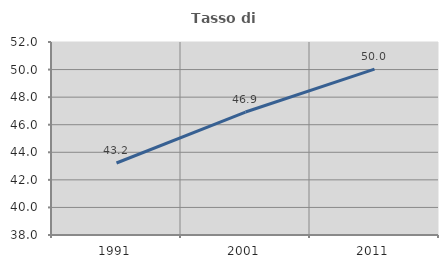
| Category | Tasso di occupazione   |
|---|---|
| 1991.0 | 43.223 |
| 2001.0 | 46.921 |
| 2011.0 | 50.036 |